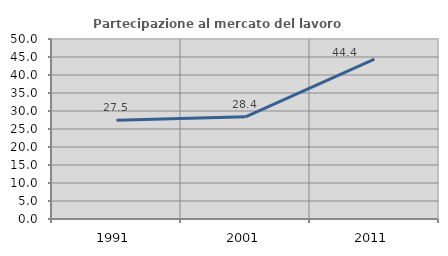
| Category | Partecipazione al mercato del lavoro  femminile |
|---|---|
| 1991.0 | 27.458 |
| 2001.0 | 28.374 |
| 2011.0 | 44.409 |